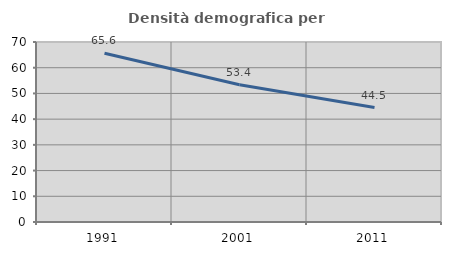
| Category | Densità demografica |
|---|---|
| 1991.0 | 65.648 |
| 2001.0 | 53.392 |
| 2011.0 | 44.493 |